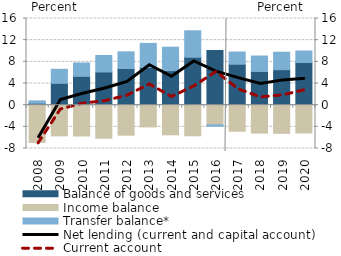
| Category | Balance of goods and services | Income balance | Transfer balance* |
|---|---|---|---|
| 2008.0 | 0.357 | -6.883 | 0.435 |
| 2009.0 | 4.031 | -5.668 | 2.592 |
| 2010.0 | 5.32 | -5.693 | 2.467 |
| 2011.0 | 6.13 | -6.106 | 3.042 |
| 2012.0 | 6.766 | -5.543 | 3.075 |
| 2013.0 | 6.964 | -4.021 | 4.439 |
| 2014.0 | 6.376 | -5.476 | 4.328 |
| 2015.0 | 8.853 | -5.655 | 4.879 |
| 2016.0 | 10.09 | -3.63 | -0.258 |
| 2017.0 | 7.552 | -4.815 | 2.254 |
| 2018.0 | 6.224 | -5.16 | 2.849 |
| 2019.0 | 6.549 | -5.199 | 3.223 |
| 2020.0 | 7.869 | -5.132 | 2.127 |